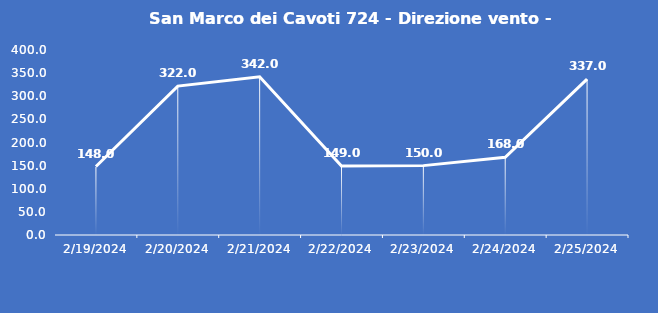
| Category | San Marco dei Cavoti 724 - Direzione vento - Grezzo (°N) |
|---|---|
| 2/19/24 | 148 |
| 2/20/24 | 322 |
| 2/21/24 | 342 |
| 2/22/24 | 149 |
| 2/23/24 | 150 |
| 2/24/24 | 168 |
| 2/25/24 | 337 |